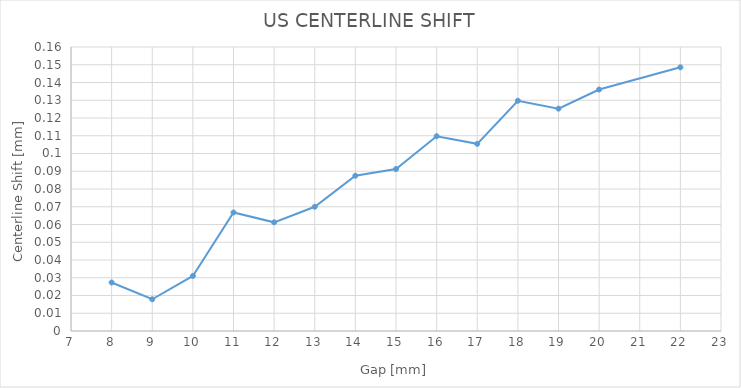
| Category | disabled |
|---|---|
| 8.0 | 0.027 |
| 9.0 | 0.018 |
| 10.0 | 0.031 |
| 11.0 | 0.067 |
| 12.0 | 0.061 |
| 13.0 | 0.07 |
| 14.0 | 0.088 |
| 15.0 | 0.091 |
| 16.0 | 0.11 |
| 17.0 | 0.105 |
| 18.0 | 0.13 |
| 19.0 | 0.125 |
| 20.0 | 0.136 |
| 22.0 | 0.149 |